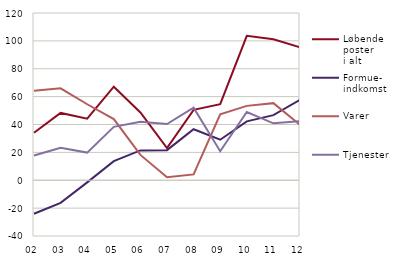
| Category | Løbende
poster
i alt | Formue-
indkomst | Varer | Tjenester |
|---|---|---|---|---|
| 02 | 34.116 | -24.039 | 64.301 | 17.807 |
| 03 | 48.298 | -16.227 | 65.923 | 23.231 |
| 04 | 44.193 | -1.523 | 54.526 | 19.843 |
| 05 | 67.137 | 13.671 | 43.913 | 38.315 |
| 06 | 48.593 | 21.429 | 18.194 | 41.964 |
| 07 | 23.049 | 21.608 | 2.142 | 40.348 |
| 08 | 50.522 | 36.604 | 4.202 | 52.057 |
| 09 | 54.546 | 29.073 | 47.351 | 20.793 |
| 10 | 103.647 | 42.234 | 53.373 | 48.951 |
| 11 | 101.197 | 46.688 | 55.317 | 40.853 |
| 12 | 95.434 | 57.697 | 39.839 | 42.375 |